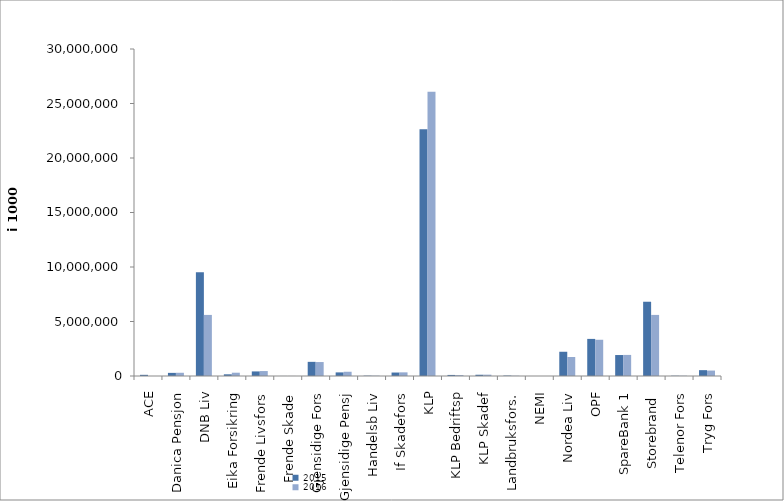
| Category | 2015 | 2016 |
|---|---|---|
| ACE | 107796.071 | 0 |
| Danica Pensjon | 286629.186 | 295963.575 |
| DNB Liv | 9525883.1 | 5603733 |
| Eika Forsikring | 155420 | 302208 |
| Frende Livsfors | 420360 | 454023 |
| Frende Skade | 3484 | 4460 |
| Gjensidige Fors | 1298243 | 1280022 |
| Gjensidige Pensj | 330723.061 | 389414.366 |
| Handelsb Liv | 30813 | 29736 |
| If Skadefors | 318230 | 334860.866 |
| KLP | 22629543.953 | 26078051.357 |
| KLP Bedriftsp | 97608 | 82464 |
| KLP Skadef | 115246 | 122502 |
| Landbruksfors. | 39072 | 22948 |
| NEMI | 2557 | 1465 |
| Nordea Liv | 2223727.554 | 1741415.588 |
| OPF | 3403757 | 3324961 |
| SpareBank 1 | 1923454.848 | 1933661.032 |
| Storebrand  | 6813087.393 | 5604066.092 |
| Telenor Fors | 24715 | 25828 |
| Tryg Fors | 536115.742 | 499374.443 |